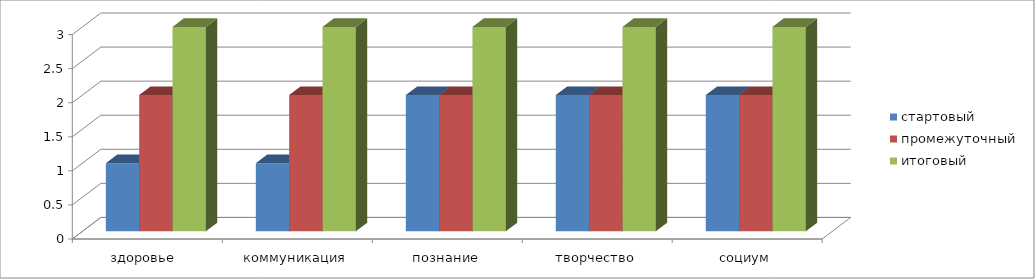
| Category | стартовый | промежуточный | итоговый |
|---|---|---|---|
| здоровье  | 1 | 2 | 3 |
| коммуникация | 1 | 2 | 3 |
| познание | 2 | 2 | 3 |
| творчество | 2 | 2 | 3 |
| социум | 2 | 2 | 3 |